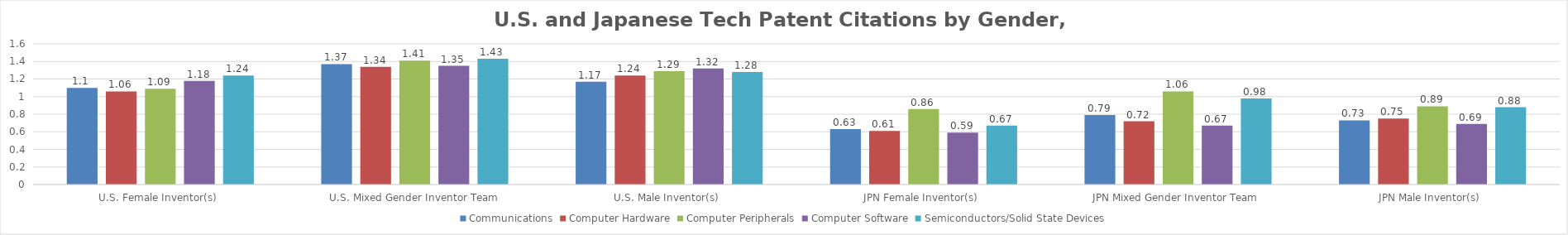
| Category | Communications | Computer Hardware | Computer Peripherals | Computer Software | Semiconductors/Solid State Devices |
|---|---|---|---|---|---|
| U.S. Female Inventor(s)  | 1.1 | 1.06 | 1.09 | 1.18 | 1.24 |
| U.S. Mixed Gender Inventor Team | 1.37 | 1.34 | 1.41 | 1.35 | 1.43 |
| U.S. Male Inventor(s)  | 1.17 | 1.24 | 1.29 | 1.32 | 1.28 |
| JPN Female Inventor(s)  | 0.63 | 0.61 | 0.86 | 0.59 | 0.67 |
| JPN Mixed Gender Inventor Team  | 0.79 | 0.72 | 1.06 | 0.67 | 0.98 |
| JPN Male Inventor(s)  | 0.73 | 0.75 | 0.89 | 0.69 | 0.88 |